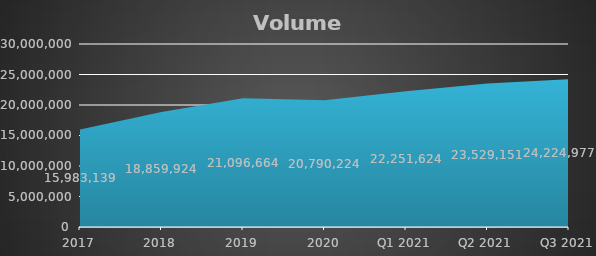
| Category | Metric Tons |
|---|---|
| 2017 | 15983139 |
| 2018 | 18859924 |
| 2019 | 21096664 |
| 2020 | 20790224 |
| Q1 2021 | 22251624 |
| Q2 2021 | 23529151 |
| Q3 2021 | 24224977 |